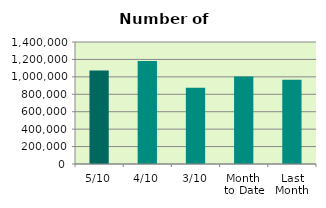
| Category | Series 0 |
|---|---|
| 5/10 | 1074322 |
| 4/10 | 1181378 |
| 3/10 | 875048 |
| Month 
to Date | 1004876.4 |
| Last
Month | 967047.5 |